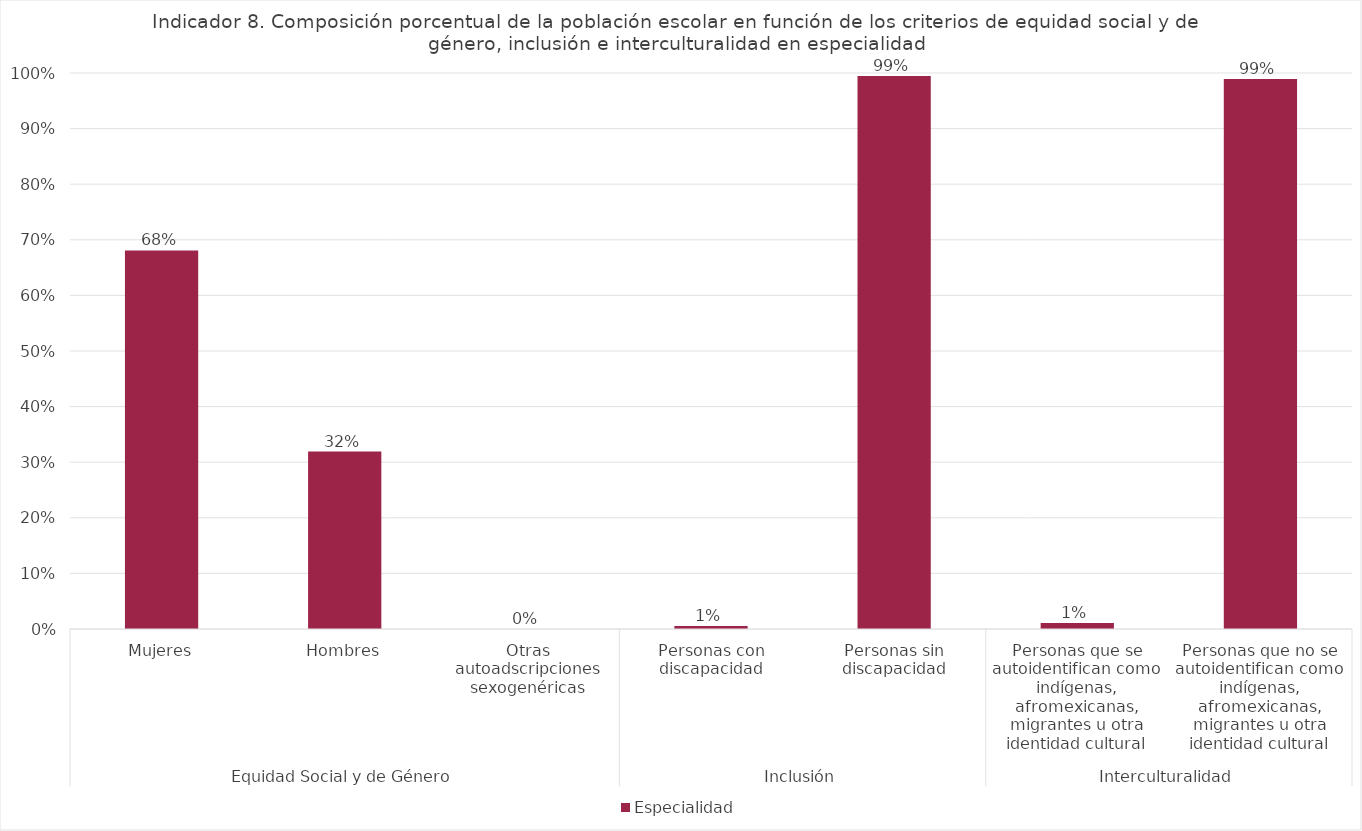
| Category | Especialidad |
|---|---|
| 0 | 0.681 |
| 1 | 0.319 |
| 2 | 0 |
| 3 | 0.005 |
| 4 | 0.995 |
| 5 | 0.011 |
| 6 | 0.989 |